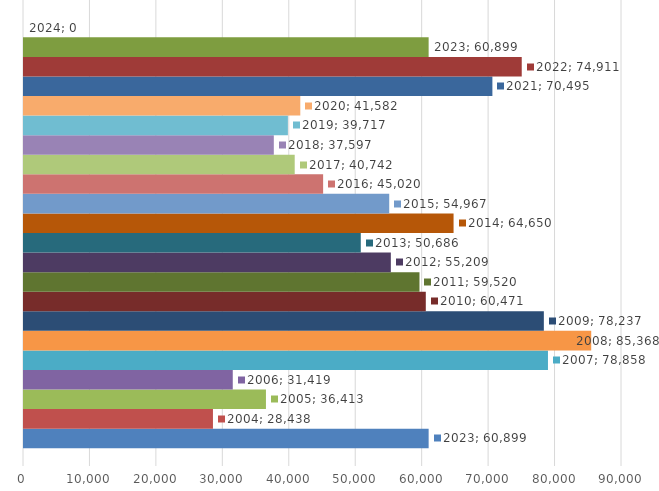
| Category | 2023 | 2004 | 2005 | 2006 | 2007 | 2008 | 2009 | 2010 | 2011 | 2012 | 2013 | 2014 | 2015 | 2016 | 2017 | 2018 | 2019 | 2020 | 2021 | 2022 | 2024 |
|---|---|---|---|---|---|---|---|---|---|---|---|---|---|---|---|---|---|---|---|---|---|
| 0 | 60899 | 28438 | 36413 | 31419 | 78858 | 85368 | 78237 | 60471 | 59520 | 55209 | 50686 | 64650 | 54967 | 45020 | 40742 | 37597 | 39717 | 41582 | 70495 | 74911 | 0 |